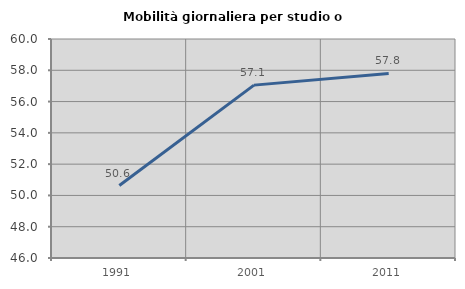
| Category | Mobilità giornaliera per studio o lavoro |
|---|---|
| 1991.0 | 50.63 |
| 2001.0 | 57.051 |
| 2011.0 | 57.798 |